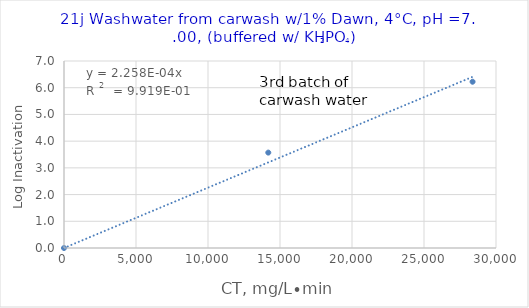
| Category | Series 0 |
|---|---|
| 0.0 | 0 |
| 14186.507936507936 | 3.571 |
| 28373.015873015873 | 6.224 |